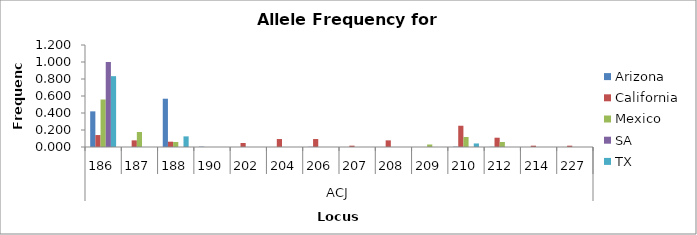
| Category | Arizona | California | Mexico | SA | TX |
|---|---|---|---|---|---|
| 0 | 0.419 | 0.141 | 0.559 | 1 | 0.833 |
| 1 | 0 | 0.078 | 0.176 | 0 | 0 |
| 2 | 0.568 | 0.062 | 0.059 | 0 | 0.125 |
| 3 | 0.004 | 0 | 0 | 0 | 0 |
| 4 | 0 | 0.047 | 0 | 0 | 0 |
| 5 | 0 | 0.094 | 0 | 0 | 0 |
| 6 | 0.002 | 0.094 | 0 | 0 | 0 |
| 7 | 0 | 0.016 | 0 | 0 | 0 |
| 8 | 0 | 0.078 | 0 | 0 | 0 |
| 9 | 0 | 0 | 0.029 | 0 | 0 |
| 10 | 0.004 | 0.25 | 0.118 | 0 | 0.042 |
| 11 | 0.002 | 0.109 | 0.059 | 0 | 0 |
| 12 | 0 | 0.016 | 0 | 0 | 0 |
| 13 | 0 | 0.016 | 0 | 0 | 0 |